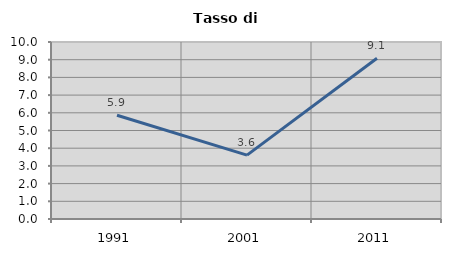
| Category | Tasso di disoccupazione   |
|---|---|
| 1991.0 | 5.862 |
| 2001.0 | 3.609 |
| 2011.0 | 9.082 |